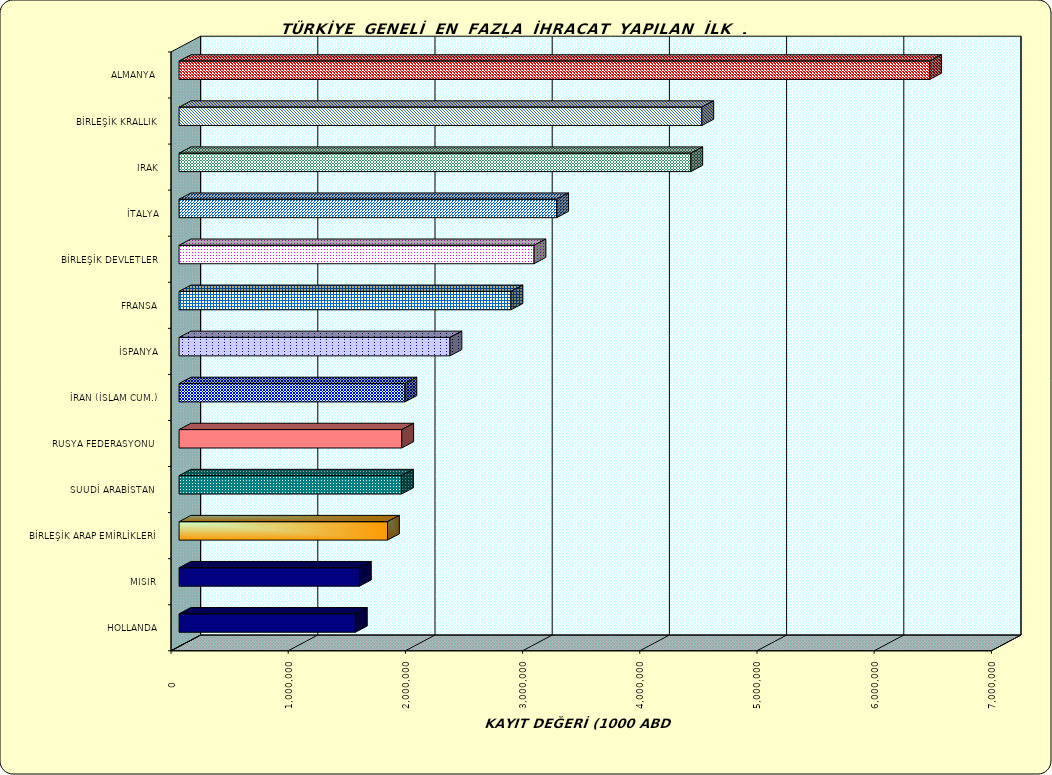
| Category | Series 0 |
|---|---|
| ALMANYA  | 6404928.667 |
| BİRLEŞİK KRALLIK | 4460605.475 |
| IRAK | 4366410.748 |
| İTALYA | 3222273.691 |
| BİRLEŞİK DEVLETLER | 3028748.284 |
| FRANSA | 2832354.427 |
| İSPANYA | 2311609.227 |
| İRAN (İSLAM CUM.) | 1927275.287 |
| RUSYA FEDERASYONU  | 1900380.684 |
| SUUDİ ARABİSTAN  | 1898107.172 |
| BİRLEŞİK ARAP EMİRLİKLERİ | 1778525.367 |
| MISIR  | 1539006.65 |
| HOLLANDA | 1504420.649 |